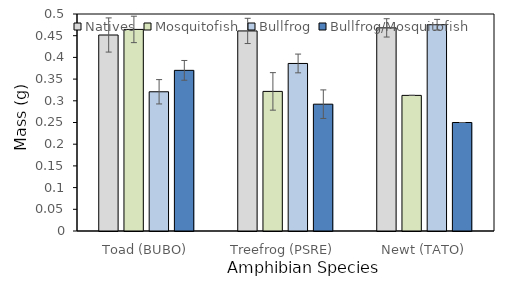
| Category | Natives | Mosquitofish | Bullfrog | Bullfrog/Mosquitofish |
|---|---|---|---|---|
| Toad (BUBO) | 0.452 | 0.464 | 0.321 | 0.37 |
| Treefrog (PSRE) | 0.461 | 0.322 | 0.386 | 0.292 |
| Newt (TATO) | 0.468 | 0.312 | 0.475 | 0.25 |